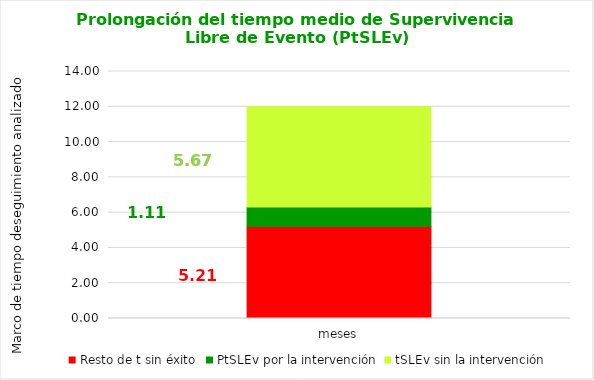
| Category | Resto de t sin éxito | PtSLEv por la intervención | tSLEv sin la intervención |
|---|---|---|---|
| meses | 5.213 | 1.113 | 5.675 |